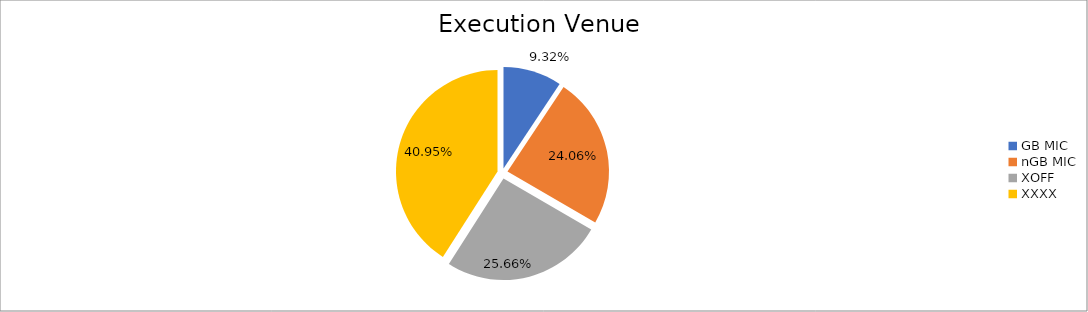
| Category | Series 0 |
|---|---|
| GB MIC | 1063839.716 |
| nGB MIC | 2746680.545 |
| XOFF | 2928877.028 |
| XXXX | 4674575.73 |